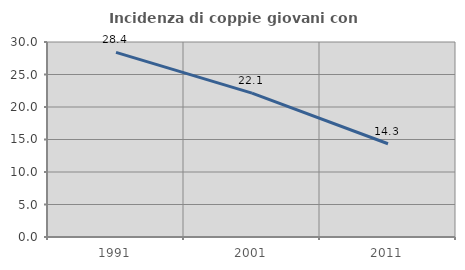
| Category | Incidenza di coppie giovani con figli |
|---|---|
| 1991.0 | 28.395 |
| 2001.0 | 22.143 |
| 2011.0 | 14.348 |